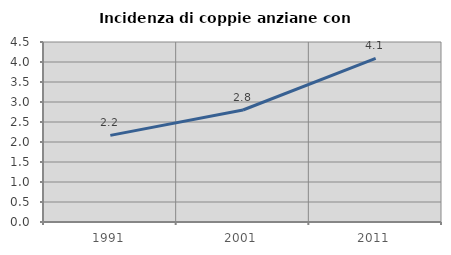
| Category | Incidenza di coppie anziane con figli |
|---|---|
| 1991.0 | 2.166 |
| 2001.0 | 2.8 |
| 2011.0 | 4.089 |